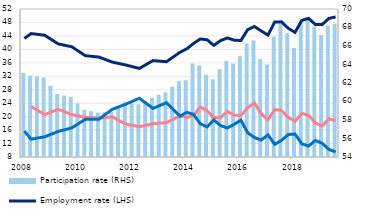
| Category | Participation rate (RHS) |
|---|---|
| 2008 | 63.1 |
| II | 62.8 |
| III | 62.7 |
| IV | 62.6 |
| 2009 | 61.7 |
| II | 60.8 |
| III | 60.65 |
| IV | 60.5 |
| 2010 | 59.8 |
| II | 59.1 |
| III | 58.95 |
| IV | 58.8 |
| 2011 | 58.85 |
| II | 58.9 |
| III | 59.4 |
| IV | 59.9 |
| 2012 | 59.8 |
| II | 59.7 |
| III | 60.05 |
| IV | 60.4 |
| 2013 | 60.7 |
| II | 61 |
| III | 61.6 |
| IV | 62.2 |
| 2014 | 62.3 |
| II | 64.1 |
| III | 63.9 |
| IV | 62.9 |
| 2015 | 62.4 |
| II | 63.5 |
| III | 64.4 |
| IV | 64.1 |
| 2016 | 64.9 |
| II | 66.3 |
| III | 66.6 |
| IV | 64.6 |
| 2017 | 64 |
| II | 67 |
| III | 68.4 |
| IV | 67.4 |
| 2018 | 65.8 |
| II | 68.5 |
| III | 69 |
| IV | 68.1 |
| 2019 | 67.2 |
| II | 68.2 |
| III | 68.4 |